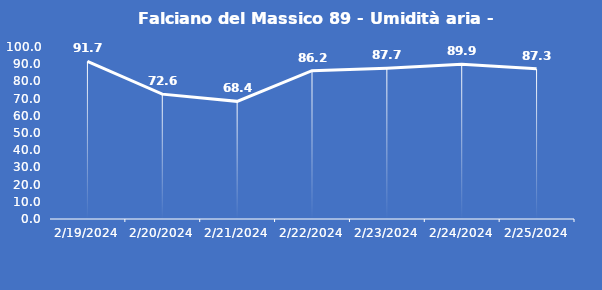
| Category | Falciano del Massico 89 - Umidità aria - Grezzo (%) |
|---|---|
| 2/19/24 | 91.7 |
| 2/20/24 | 72.6 |
| 2/21/24 | 68.4 |
| 2/22/24 | 86.2 |
| 2/23/24 | 87.7 |
| 2/24/24 | 89.9 |
| 2/25/24 | 87.3 |